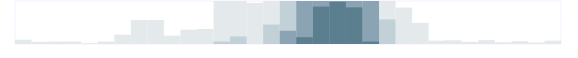
| Category | Бухгалтерия | Series 1 | Series 2 | Series 3 |
|---|---|---|---|---|
| 0.333333333333333 | 75 | 0 | 0 | 0 |
| nan | 37 | 0 | 0 | 0 |
| nan | 42 | 0 | 0 | 0 |
| nan | 43 | 0 | 0 | 0 |
| 0.416666666666667 | 14 | 0 | 0 | 0 |
| nan | 42 | 0 | 0 | 0 |
| nan | 163 | 0 | 0 | 0 |
| nan | 418 | 0 | 0 | 0 |
| 0.5 | 419 | 0 | 0 | 0 |
| nan | 145 | 0 | 0 | 0 |
| nan | 249 | 0 | 0 | 0 |
| nan | 261 | 0 | 0 | 0 |
| 0.583333333333333 | 750 | 43 | 0 | 0 |
| nan | 750 | 131 | 0 | 0 |
| nan | 717 | 0 | 0 | 0 |
| nan | 750 | 339 | 0 | 0 |
| 0.666666666666667 | 750 | 750 | 231 | 0 |
| nan | 750 | 750 | 750 | 119 |
| nan | 750 | 750 | 750 | 653 |
| nan | 750 | 750 | 750 | 736 |
| 0.75 | 750 | 750 | 750 | 639 |
| nan | 750 | 750 | 750 | 43 |
| nan | 750 | 428 | 0 | 0 |
| nan | 635 | 0 | 0 | 0 |
| 0.833333333333333 | 368 | 0 | 0 | 0 |
| nan | 57 | 0 | 0 | 0 |
| nan | 64 | 0 | 0 | 0 |
| nan | 37 | 0 | 0 | 0 |
| 0.916666666666667 | 67 | 0 | 0 | 0 |
| nan | 29 | 0 | 0 | 0 |
| nan | 50 | 0 | 0 | 0 |
| nan | 26 | 0 | 0 | 0 |
| 0.9993055555555556 | 57 | 0 | 0 | 0 |